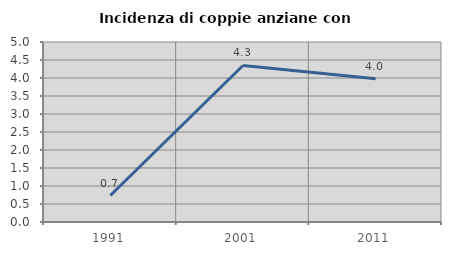
| Category | Incidenza di coppie anziane con figli |
|---|---|
| 1991.0 | 0.735 |
| 2001.0 | 4.348 |
| 2011.0 | 3.977 |